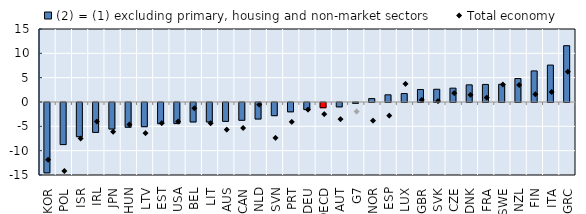
| Category | (2) = (1) excluding primary, housing and non-market sectors |
|---|---|
| KOR | -14.459 |
| POL | -8.648 |
| ISR | -7.028 |
| IRL | -6.145 |
| JPN | -5.45 |
| HUN | -5.085 |
| LTV | -4.97 |
| EST | -4.354 |
| USA | -4.333 |
| BEL | -3.998 |
| LIT | -3.996 |
| AUS | -3.876 |
| CAN | -3.657 |
| NLD | -3.392 |
| SVN | -2.71 |
| PRT | -1.914 |
| DEU | -1.455 |
| OECD | -1.073 |
| AUT | -0.896 |
| G7 | -0.161 |
| NOR | 0.709 |
| ESP | 1.48 |
| LUX | 1.734 |
| GBR | 2.569 |
| SVK | 2.62 |
| CZE | 2.847 |
| DNK | 3.525 |
| FRA | 3.609 |
| SWE | 3.639 |
| NZL | 4.824 |
| FIN | 6.388 |
| ITA | 7.588 |
| GRC | 11.573 |